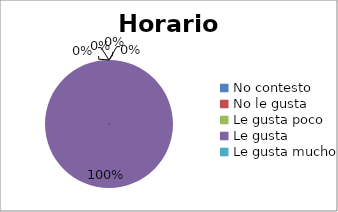
| Category | Series 0 |
|---|---|
| No contesto | 0 |
| No le gusta | 0 |
| Le gusta poco | 0 |
| Le gusta | 5 |
| Le gusta mucho | 0 |